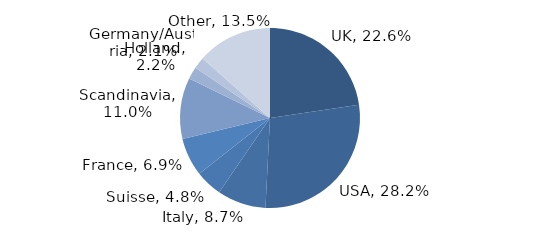
| Category | Investment Style |
|---|---|
| UK | 0.226 |
| USA | 0.282 |
| Italy | 0.087 |
| Suisse | 0.048 |
| France | 0.069 |
| Scandinavia | 0.11 |
| Holland | 0.022 |
| Germany/Austria | 0.021 |
| Other | 0.135 |